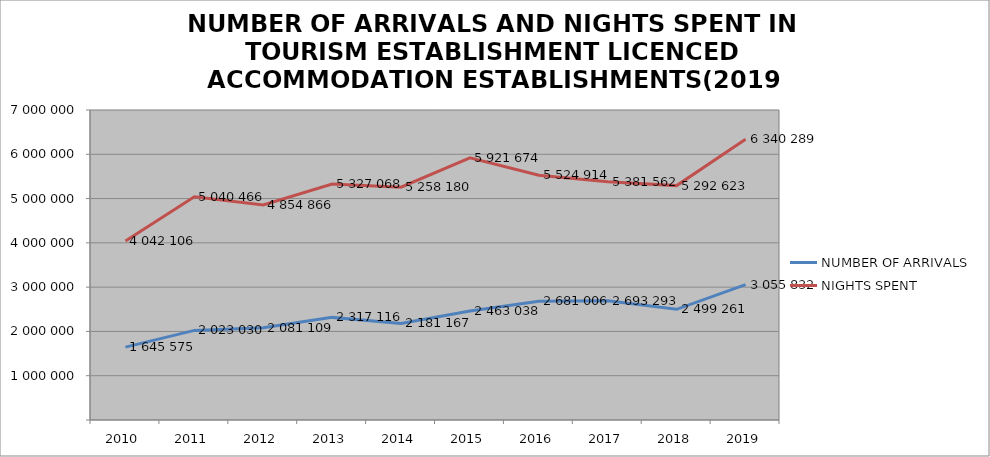
| Category | NUMBER OF ARRIVALS | NIGHTS SPENT |
|---|---|---|
| 2010 | 1645575 | 4042106 |
| 2011 | 2023030 | 5040466 |
| 2012 | 2081109 | 4854866 |
| 2013 | 2317116 | 5327068 |
| 2014 | 2181167 | 5258180 |
| 2015 | 2463038 | 5921674 |
| 2016 | 2681006 | 5524914 |
| 2017 | 2693293 | 5381562 |
| 2018 | 2499261 | 5292623 |
| 2019 | 3055832 | 6340289 |